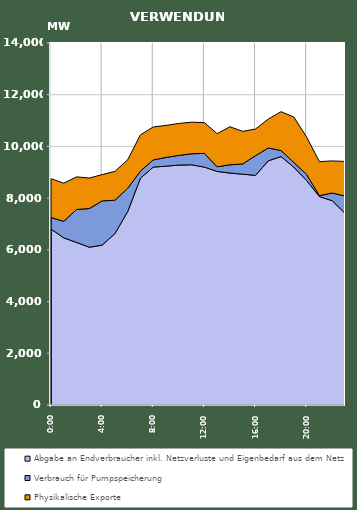
| Category | Abgabe an Endverbraucher inkl. Netzverluste und Eigenbedarf aus dem Netz | Verbrauch für Pumpspeicherung | Physikalische Exporte |
|---|---|---|---|
| 2007-01-17 | 6802.815 | 444.901 | 1504.619 |
| 2007-01-17 01:00:00 | 6464.372 | 640.417 | 1474.091 |
| 2007-01-17 02:00:00 | 6286.349 | 1273.993 | 1262.626 |
| 2007-01-17 03:00:00 | 6101.014 | 1497.585 | 1177.924 |
| 2007-01-17 04:00:00 | 6183.272 | 1709.976 | 1017.164 |
| 2007-01-17 05:00:00 | 6625.999 | 1293.614 | 1115.343 |
| 2007-01-17 06:00:00 | 7482.106 | 897.251 | 1105.906 |
| 2007-01-17 07:00:00 | 8771.208 | 275.329 | 1403.927 |
| 2007-01-17 08:00:00 | 9199.967 | 279.321 | 1274.094 |
| 2007-01-17 09:00:00 | 9236.397 | 337.424 | 1239.058 |
| 2007-01-17 10:00:00 | 9279.901 | 371.401 | 1237.48 |
| 2007-01-17 11:00:00 | 9289.094 | 426.905 | 1221.572 |
| 2007-01-17 12:00:00 | 9199.334 | 530.616 | 1192.326 |
| 2007-01-17 13:00:00 | 9033.76 | 177.21 | 1283.521 |
| 2007-01-17 14:00:00 | 8969.742 | 320.699 | 1470.311 |
| 2007-01-17 15:00:00 | 8927.201 | 395.904 | 1259.773 |
| 2007-01-17 16:00:00 | 8879.406 | 761.919 | 1032.625 |
| 2007-01-17 17:00:00 | 9444.108 | 496.162 | 1118.69 |
| 2007-01-17 18:00:00 | 9608.311 | 232.321 | 1503.288 |
| 2007-01-17 19:00:00 | 9195.395 | 183.462 | 1758.201 |
| 2007-01-17 20:00:00 | 8680.134 | 231.97 | 1448.217 |
| 2007-01-17 21:00:00 | 8060.016 | 35.511 | 1316.94 |
| 2007-01-17 22:00:00 | 7900.234 | 297.636 | 1242.636 |
| 2007-01-17 23:00:00 | 7415.404 | 665.515 | 1339.196 |